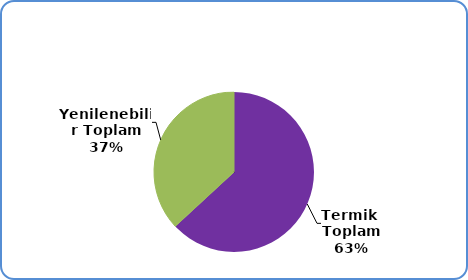
| Category | Series 0 |
|---|---|
| Termik  Toplam | 57821815.81 |
| Yenilenebilir Toplam | 33779130.97 |